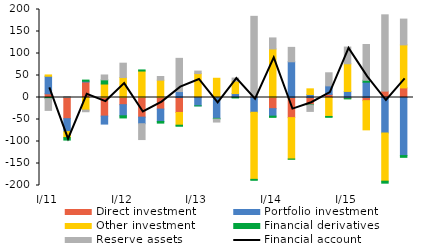
| Category | Direct investment | Portfolio investment | Other investment | Financial derivatives | Reserve assets |
|---|---|---|---|---|---|
| I/11 | 8.394 | 39.909 | 2.964 | -2.567 | -26.789 |
| II | -48.128 | -29.388 | -13.604 | -5.635 | 2.123 |
| III | 35.202 | 1.853 | -28.649 | 2.491 | -3.698 |
| IV | -42.273 | -18.154 | 30.668 | 9.385 | 11.134 |
| I/12 | -16.29 | -25.293 | 45.36 | -4.87 | 32.632 |
| II | -44.641 | -14.957 | 60.168 | 2.453 | -35.982 |
| III | -26.334 | -28.062 | 39.368 | -3.806 | 8.321 |
| IV | -33.997 | 13.465 | -28.955 | -2.395 | 75.502 |
| I/13 | 1.859 | -18.95 | 52.574 | -0.086 | 5.61 |
| II | 1.859 | -47.44 | 41.851 | -1.44 | -6.912 |
| III | 1.859 | 7.148 | 28.263 | -1.061 | 6.889 |
| IV | 1.859 | -33.596 | -152.434 | -2.15 | 182.604 |
| I/14 | -25.373 | -16.995 | 110.31 | -2.764 | 25.08 |
| II | -45.715 | 81.147 | -94.096 | -0.503 | 32.776 |
| III | -16.35 | 6.715 | 12.982 | -0.818 | -14.448 |
| IV | 7.055 | 19.403 | -43.088 | -1.962 | 29.714 |
| I/15 | -2.497 | 13.794 | 62.811 | -0.585 | 38.01 |
| II | -7.16 | 34.761 | -66.369 | 4.391 | 81.243 |
| III | 14.457 | -80.702 | -109.424 | -4.594 | 173.44 |
| IV | 21.819 | -131.988 | 97.757 | -3.981 | 58.612 |